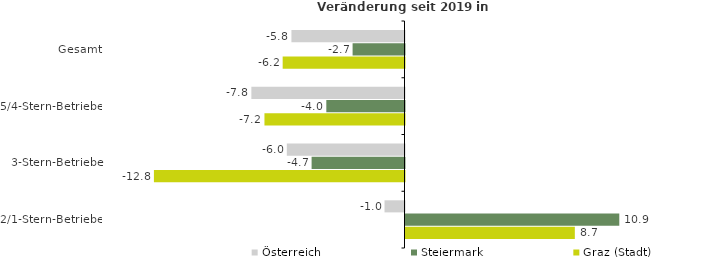
| Category | Österreich | Steiermark | Graz (Stadt) |
|---|---|---|---|
| Gesamt | -5.779 | -2.653 | -6.226 |
| 5/4-Stern-Betriebe | -7.825 | -3.996 | -7.157 |
| 3-Stern-Betriebe | -6.014 | -4.748 | -12.807 |
| 2/1-Stern-Betriebe | -1.021 | 10.926 | 8.654 |